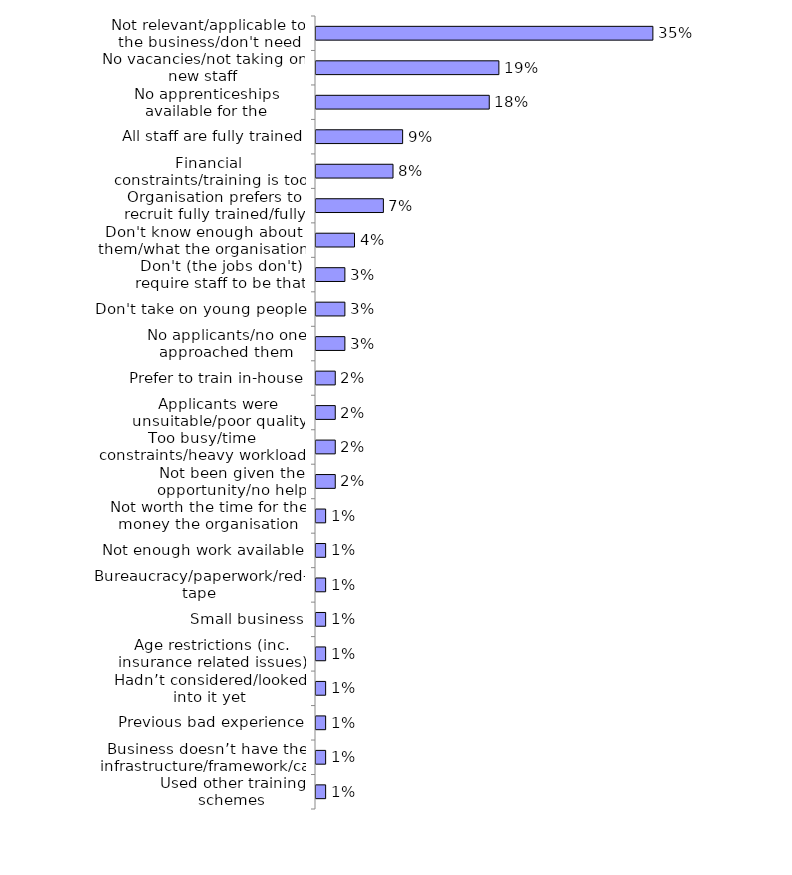
| Category | Series 0 |
|---|---|
| Not relevant/applicable to the business/don't need them | 0.35 |
| No vacancies/not taking on new staff | 0.19 |
| No apprenticeships available for the industry/sector/specialism | 0.18 |
| All staff are fully trained | 0.09 |
| Financial constraints/training is too expensive/can't afford it | 0.08 |
| Organisation prefers to recruit fully trained/fully qualified recruits | 0.07 |
| Don't know enough about them/what the organisation would have to do | 0.04 |
| Don't (the jobs don't) require staff to be that highly skilled | 0.03 |
| Don't take on young people | 0.03 |
| No applicants/no one approached them | 0.03 |
| Prefer to train in-house | 0.02 |
| Applicants were unsuitable/poor quality applicants | 0.02 |
| Too busy/time constraints/heavy workload | 0.02 |
| Not been given the opportunity/no help received | 0.02 |
| Not worth the time for the money the organisation would get | 0.01 |
| Not enough work available | 0.01 |
| Bureaucracy/paperwork/red-tape | 0.01 |
| Small business | 0.01 |
| Age restrictions (inc. insurance related issues) | 0.01 |
| Hadn’t considered/looked into it yet | 0.01 |
| Previous bad experience | 0.01 |
| Business doesn’t have the infrastructure/framework/capacity | 0.01 |
| Used other training schemes | 0.01 |